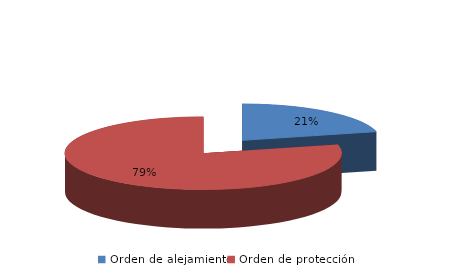
| Category | Series 0 |
|---|---|
| Orden de alejamiento | 66 |
| Orden de protección | 246 |